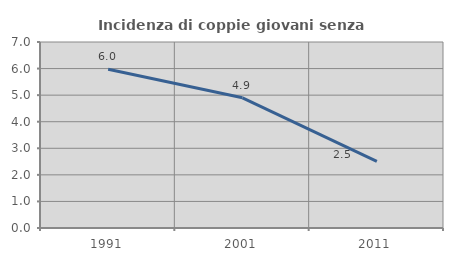
| Category | Incidenza di coppie giovani senza figli |
|---|---|
| 1991.0 | 5.975 |
| 2001.0 | 4.901 |
| 2011.0 | 2.511 |